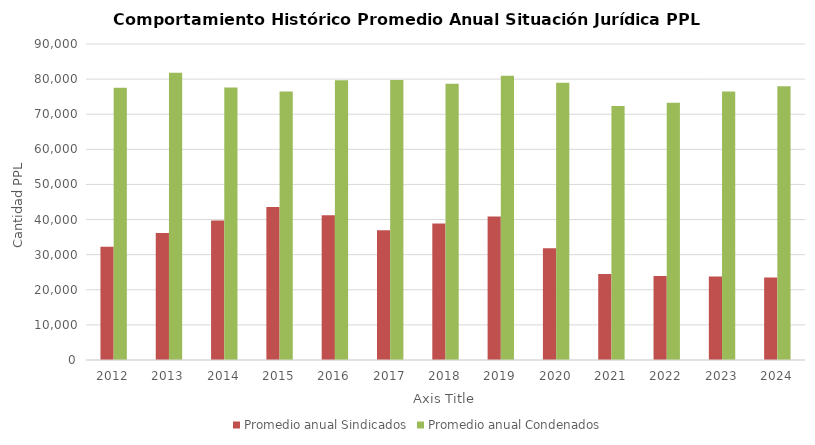
| Category | Promedio anual Sindicados | Promedio anual Condenados |
|---|---|---|
| 2012.0 | 32250.083 | 77572 |
| 2013.0 | 36194.167 | 81792.083 |
| 2014.0 | 39755 | 77634.083 |
| 2015.0 | 43545.833 | 76494.25 |
| 2016.0 | 41229.083 | 79684.917 |
| 2017.0 | 36925.5 | 79732.167 |
| 2018.0 | 38890.25 | 78679.333 |
| 2019.0 | 40870.083 | 80977.25 |
| 2020.0 | 31861.083 | 78969.25 |
| 2021.0 | 24484.417 | 72353.083 |
| 2022.0 | 23917.667 | 73258.25 |
| 2023.0 | 23757.25 | 76504.667 |
| 2024.0 | 23478 | 77939 |